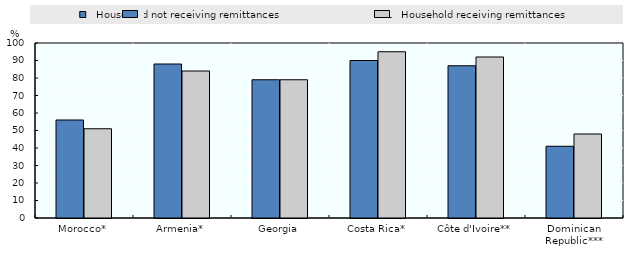
| Category |   Household not receiving remittances |   Household receiving remittances |
|---|---|---|
| Morocco* | 56 | 51 |
| Armenia* | 88 | 84 |
| Georgia | 79 | 79 |
| Costa Rica* | 90 | 95 |
| Côte d'Ivoire** | 87 | 92 |
| Dominican Republic*** | 41 | 48 |